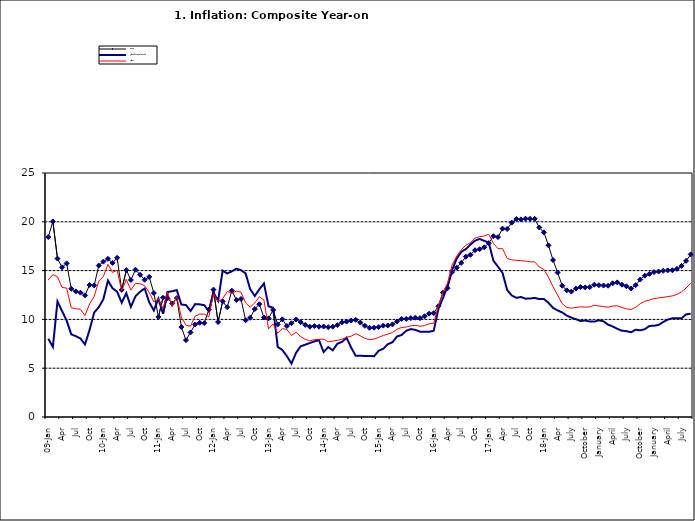
| Category | Food | All Items less Farm Produce | All Items |
|---|---|---|---|
| 09-Jan | 18.436 | 8.013 | 14.034 |
| Feb | 20.041 | 7.178 | 14.584 |
| Mar | 16.233 | 11.842 | 14.366 |
| Apr | 15.342 | 10.85 | 13.268 |
| May | 15.74 | 9.88 | 13.212 |
| June | 13.138 | 8.472 | 11.194 |
| Jul | 12.867 | 8.285 | 11.09 |
| Aug | 12.746 | 8.044 | 11.046 |
| Sep | 12.472 | 7.431 | 10.39 |
| Oct | 13.524 | 8.933 | 11.588 |
| Nov | 13.482 | 10.702 | 12.368 |
| Dec | 15.518 | 11.249 | 13.93 |
| 10-Jan | 15.918 | 12.063 | 14.398 |
| Feb | 16.208 | 13.978 | 15.649 |
| Mar | 15.79 | 13.184 | 14.812 |
| Apr | 16.306 | 12.844 | 15.044 |
| May | 13.023 | 11.711 | 12.915 |
| Jun | 15.053 | 12.686 | 14.099 |
| Jul | 14.043 | 11.287 | 13.002 |
| Aug | 15.09 | 12.366 | 13.702 |
| Sep | 14.57 | 12.83 | 13.65 |
| Oct | 14.065 | 13.168 | 13.45 |
| Nov | 14.351 | 11.746 | 12.766 |
| Dec | 12.701 | 10.917 | 11.815 |
| 11-Jan | 10.255 | 12.118 | 12.08 |
| Feb | 12.221 | 10.569 | 11.1 |
| Mar | 12.169 | 12.815 | 12.779 |
| Apr | 11.629 | 12.882 | 11.291 |
| May | 12.179 | 13.006 | 12.352 |
| Jun | 9.22 | 11.524 | 10.23 |
| Jul | 7.877 | 11.472 | 9.397 |
| Aug | 8.665 | 10.863 | 9.301 |
| Sep | 9.479 | 11.567 | 10.339 |
| Oct | 9.656 | 11.539 | 10.544 |
| Nov | 9.623 | 11.459 | 10.54 |
| Dec | 11.02 | 10.822 | 10.283 |
| 12-Jan | 13.053 | 12.748 | 12.626 |
| 12-Feb | 9.729 | 11.901 | 11.866 |
| 12-Mar | 11.848 | 14.995 | 12.111 |
| Apr | 11.246 | 14.703 | 12.866 |
| May | 12.942 | 14.926 | 12.688 |
| Jun | 11.991 | 15.199 | 12.892 |
| Jul | 12.093 | 15.045 | 12.797 |
| Aug | 9.91 | 14.714 | 11.689 |
| Sep | 10.164 | 13.101 | 11.253 |
| Oct | 11.064 | 12.398 | 11.693 |
| Nov | 11.553 | 13.092 | 12.32 |
| Dec | 10.199 | 13.685 | 11.981 |
| 13-Jan | 10.106 | 11.342 | 9.031 |
| Feb | 10.973 | 11.184 | 9.542 |
| Mar | 9.482 | 7.179 | 8.593 |
| Apr | 10.006 | 6.874 | 9.052 |
| May | 9.321 | 6.227 | 8.964 |
| Jun | 9.606 | 5.472 | 8.353 |
| Jul | 9.994 | 6.58 | 8.682 |
| Aug | 9.723 | 7.245 | 8.231 |
| Sep | 9.437 | 7.41 | 7.952 |
| Oct | 9.249 | 7.579 | 7.807 |
| Nov | 9.313 | 7.75 | 7.931 |
| Dec | 9.253 | 7.872 | 7.957 |
| 14-Jan | 9.271 | 6.648 | 7.977 |
| Feb | 9.207 | 7.166 | 7.707 |
| Mar | 9.254 | 6.836 | 7.783 |
| Apr | 9.414 | 7.508 | 7.851 |
| May | 9.698 | 7.693 | 7.965 |
| Jun | 9.776 | 8.122 | 8.167 |
| Jul | 9.878 | 7.116 | 8.281 |
| Aug | 9.959 | 6.264 | 8.534 |
| Sep | 9.676 | 6.278 | 8.317 |
| Oct | 9.343 | 6.252 | 8.06 |
| Nov | 9.144 | 6.255 | 7.927 |
| Dec | 9.152 | 6.225 | 7.978 |
| 15-Jan | 9.215 | 6.787 | 8.157 |
| Feb | 9.359 | 6.994 | 8.359 |
| Mar | 9.376 | 7.46 | 8.494 |
| Apr | 9.49 | 7.661 | 8.655 |
| May | 9.782 | 8.253 | 9.003 |
| Jun | 10.041 | 8.403 | 9.168 |
| Jul | 10.049 | 8.83 | 9.218 |
| Aug | 10.131 | 9.01 | 9.336 |
| Sep | 10.174 | 8.928 | 9.394 |
| Oct | 10.129 | 8.742 | 9.296 |
| Nov | 10.321 | 8.732 | 9.368 |
| Dec | 10.588 | 8.727 | 9.554 |
| 16-Jan | 10.642 | 8.841 | 9.617 |
| Feb | 11.348 | 11.041 | 11.379 |
| Mar | 12.745 | 12.17 | 12.775 |
| Apr | 13.194 | 13.352 | 13.721 |
| May | 14.861 | 15.054 | 15.577 |
| Jun | 15.302 | 16.224 | 16.48 |
| Jul | 15.799 | 16.929 | 17.127 |
| Aug | 16.427 | 17.208 | 17.609 |
| Sep | 16.622 | 17.666 | 17.852 |
| Oct | 17.09 | 18.067 | 18.33 |
| Nov | 17.191 | 18.241 | 18.476 |
| Dec | 17.388 | 18.052 | 18.547 |
| 17-Jan | 17.818 | 17.867 | 18.719 |
| Feb | 18.528 | 16.011 | 17.78 |
| Mar | 18.436 | 15.404 | 17.256 |
| Apr | 19.303 | 14.75 | 17.244 |
| May | 19.266 | 13.016 | 16.251 |
| Jun | 19.915 | 12.455 | 16.098 |
| Jul | 20.284 | 12.207 | 16.053 |
| Aug | 20.251 | 12.296 | 16.012 |
| Sep | 20.321 | 12.123 | 15.979 |
| Oct | 20.306 | 12.142 | 15.905 |
| Nov | 20.308 | 12.206 | 15.901 |
| Dec | 19.415 | 12.089 | 15.372 |
| 18-Jan | 18.919 | 12.09 | 15.127 |
| Feb | 17.588 | 11.707 | 14.33 |
| Mar | 16.08 | 11.181 | 13.337 |
| Apr | 14.799 | 10.92 | 12.482 |
| May | 13.448 | 10.71 | 11.608 |
| June | 12.977 | 10.387 | 11.231 |
| July | 12.85 | 10.183 | 11.142 |
| August | 13.158 | 10.015 | 11.227 |
| September | 13.309 | 9.838 | 11.284 |
| October | 13.277 | 9.882 | 11.259 |
| November | 13.301 | 9.787 | 11.281 |
| December | 13.559 | 9.771 | 11.442 |
| January | 13.505 | 9.91 | 11.374 |
| February | 13.473 | 9.8 | 11.306 |
| March | 13.451 | 9.461 | 11.251 |
| April | 13.701 | 9.28 | 11.372 |
| May | 13.794 | 9.033 | 11.396 |
| June | 13.558 | 8.841 | 11.217 |
| July | 13.392 | 8.798 | 11.084 |
| August | 13.17 | 8.678 | 11.016 |
| September | 13.507 | 8.945 | 11.244 |
| October | 14.088 | 8.876 | 11.607 |
| November | 14.482 | 8.993 | 11.854 |
| December | 14.667 | 9.331 | 11.982 |
| January | 14.849 | 9.349 | 12.132 |
| February | 14.904 | 9.434 | 12.199 |
| March | 14.977 | 9.732 | 12.257 |
| April | 15.026 | 9.979 | 12.341 |
| May | 15.036 | 10.12 | 12.404 |
| June | 15.175 | 10.128 | 12.559 |
| July | 15.482 | 10.102 | 12.821 |
| August | 15.996 | 10.521 | 13.22 |
| September | 16.66 | 10.581 | 13.707 |